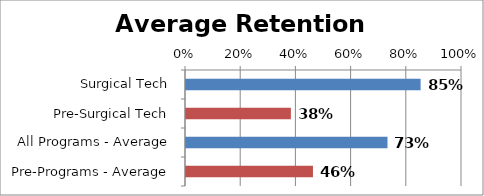
| Category | RetentionRate |
|---|---|
| Surgical Tech | 0.85 |
| Pre-Surgical Tech | 0.38 |
| All Programs - Average | 0.73 |
| Pre-Programs - Average | 0.46 |